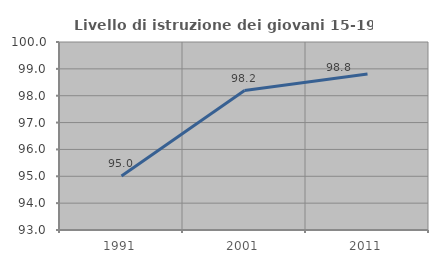
| Category | Livello di istruzione dei giovani 15-19 anni |
|---|---|
| 1991.0 | 95.014 |
| 2001.0 | 98.193 |
| 2011.0 | 98.806 |